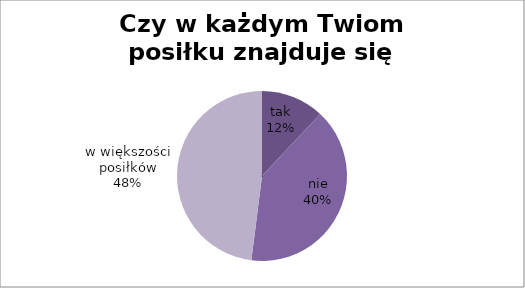
| Category | Czy w każdym Twiom posiłku znajduje się mięso? |
|---|---|
| tak | 12 |
| nie | 40 |
| w większości posiłków | 48 |